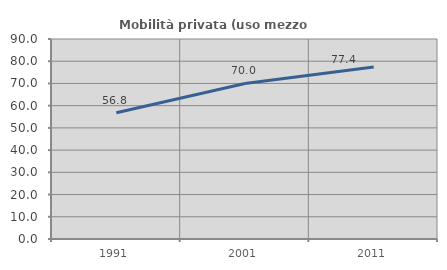
| Category | Mobilità privata (uso mezzo privato) |
|---|---|
| 1991.0 | 56.799 |
| 2001.0 | 69.981 |
| 2011.0 | 77.421 |